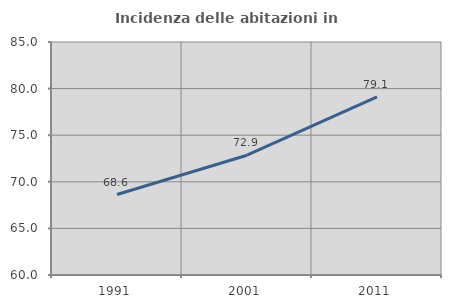
| Category | Incidenza delle abitazioni in proprietà  |
|---|---|
| 1991.0 | 68.635 |
| 2001.0 | 72.852 |
| 2011.0 | 79.118 |